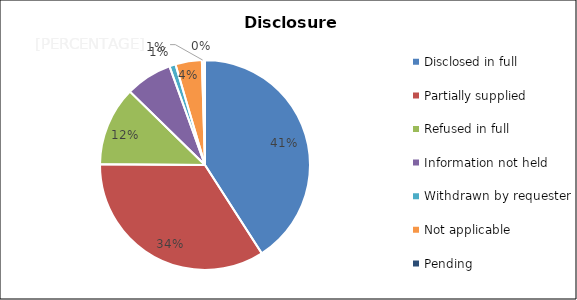
| Category | Series 0 |
|---|---|
| Disclosed in full | 171 |
| Partially supplied | 143 |
| Refused in full | 51 |
| Information not held | 30 |
| Withdrawn by requester | 4 |
| Not applicable | 17 |
| Pending | 1 |
| Withheld due to fee being charged but not received | 1 |